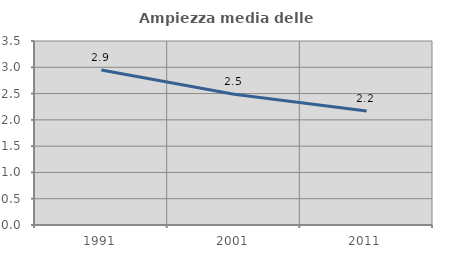
| Category | Ampiezza media delle famiglie |
|---|---|
| 1991.0 | 2.949 |
| 2001.0 | 2.489 |
| 2011.0 | 2.17 |